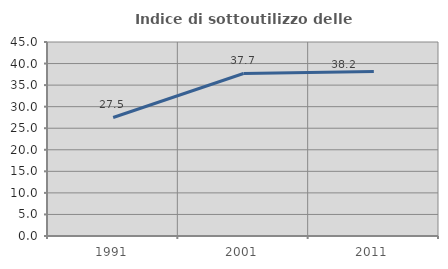
| Category | Indice di sottoutilizzo delle abitazioni  |
|---|---|
| 1991.0 | 27.491 |
| 2001.0 | 37.702 |
| 2011.0 | 38.159 |